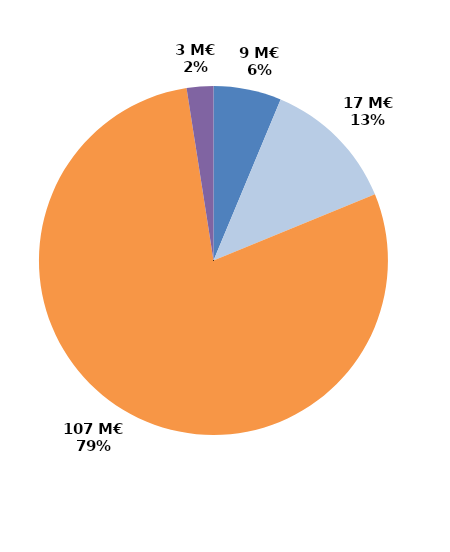
| Category | Series 0 |
|---|---|
| CIF - CPF | 8.576 |
| Période de professionnalisation | 17.068 |
| Plan de formation | 107.392 |
| Autres | 3.369 |